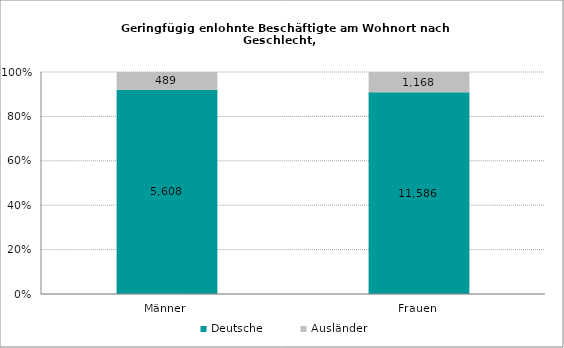
| Category | Deutsche | Ausländer |
|---|---|---|
| Männer | 5608 | 489 |
| Frauen | 11586 | 1168 |